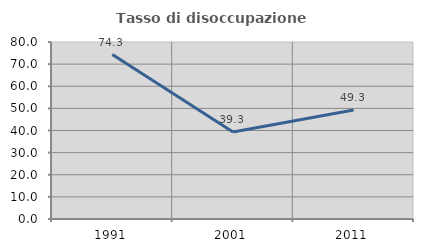
| Category | Tasso di disoccupazione giovanile  |
|---|---|
| 1991.0 | 74.339 |
| 2001.0 | 39.333 |
| 2011.0 | 49.286 |